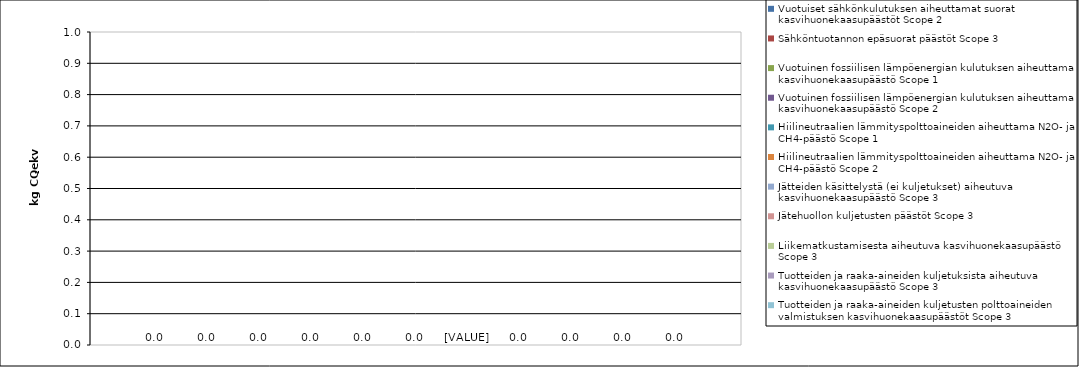
| Category | Vuotuiset sähkönkulutuksen aiheuttamat suorat kasvihuonekaasupäästöt Scope 2 | Sähköntuotannon epäsuorat päästöt Scope 3 | Vuotuinen fossiilisen lämpöenergian kulutuksen aiheuttama kasvihuonekaasupäästö Scope 1 | Vuotuinen fossiilisen lämpöenergian kulutuksen aiheuttama kasvihuonekaasupäästö Scope 2 | Hiilineutraalien lämmityspolttoaineiden aiheuttama N2O- ja CH4-päästö Scope 1 | Hiilineutraalien lämmityspolttoaineiden aiheuttama N2O- ja CH4-päästö Scope 2 | Jätteiden käsittelystä (ei kuljetukset) aiheutuva kasvihuonekaasupäästö Scope 3 | Jätehuollon kuljetusten päästöt Scope 3 | Liikematkustamisesta aiheutuva kasvihuonekaasupäästö Scope 3 | Tuotteiden ja raaka-aineiden kuljetuksista aiheutuva kasvihuonekaasupäästö Scope 3 | Tuotteiden ja raaka-aineiden kuljetusten polttoaineiden valmistuksen kasvihuonekaasupäästöt Scope 3 |
|---|---|---|---|---|---|---|---|---|---|---|---|
| 0 | 0 | 0 | 0 | 0 | 0 | 0 | 0 | 0 | 0 | 0 | 0 |